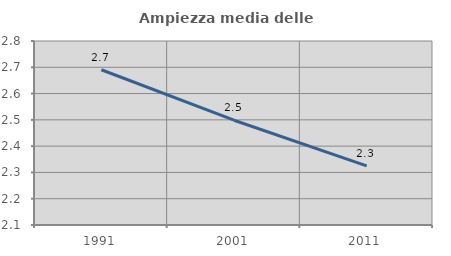
| Category | Ampiezza media delle famiglie |
|---|---|
| 1991.0 | 2.691 |
| 2001.0 | 2.499 |
| 2011.0 | 2.325 |